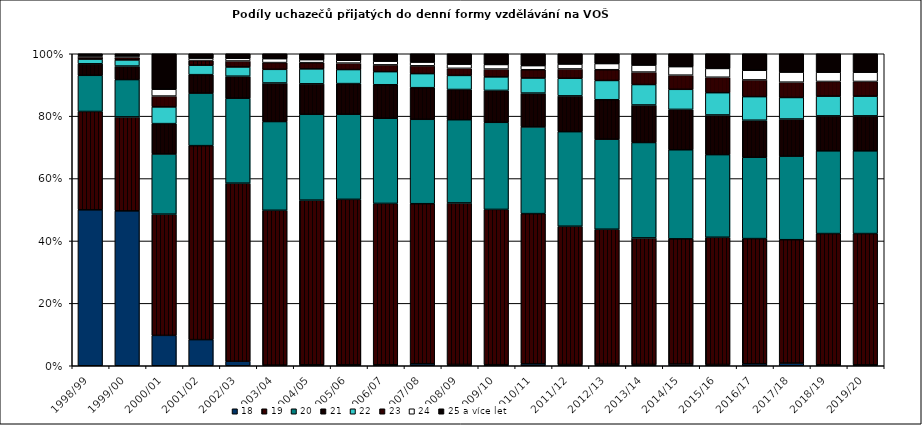
| Category | 18 | 19 | 20 | 21 | 22 | 23 | 24 | 25 a více let  |
|---|---|---|---|---|---|---|---|---|
| 1998/99 | 0.5 | 0.315 | 0.116 | 0.037 | 0.015 | 0.007 | 0.005 | 0.006 |
| 1999/00 | 0.496 | 0.301 | 0.12 | 0.043 | 0.02 | 0.008 | 0.005 | 0.007 |
| 2000/01 | 0.097 | 0.389 | 0.193 | 0.097 | 0.054 | 0.035 | 0.022 | 0.114 |
| 2001/02 | 0.084 | 0.622 | 0.168 | 0.059 | 0.03 | 0.015 | 0.008 | 0.014 |
| 2002/03 | 0.014 | 0.571 | 0.272 | 0.071 | 0.03 | 0.019 | 0.009 | 0.015 |
| 2003/04 | 0.002 | 0.496 | 0.284 | 0.124 | 0.044 | 0.022 | 0.013 | 0.016 |
| 2004/05 | 0.003 | 0.528 | 0.275 | 0.098 | 0.048 | 0.02 | 0.01 | 0.019 |
| 2005/06 | 0.003 | 0.53 | 0.273 | 0.098 | 0.045 | 0.021 | 0.009 | 0.021 |
| 2006/07 | 0.003 | 0.517 | 0.273 | 0.107 | 0.042 | 0.022 | 0.012 | 0.024 |
| 2007/08 | 0.006 | 0.513 | 0.271 | 0.101 | 0.045 | 0.025 | 0.012 | 0.027 |
| 2008/09 | 0.004 | 0.518 | 0.267 | 0.097 | 0.045 | 0.023 | 0.013 | 0.033 |
| 2009/10 | 0.003 | 0.498 | 0.279 | 0.102 | 0.043 | 0.025 | 0.015 | 0.034 |
| 2010/11 | 0.006 | 0.481 | 0.278 | 0.108 | 0.048 | 0.027 | 0.013 | 0.038 |
| 2011/12 | 0.004 | 0.443 | 0.303 | 0.115 | 0.056 | 0.03 | 0.016 | 0.033 |
| 2012/13 | 0.005 | 0.433 | 0.289 | 0.126 | 0.062 | 0.034 | 0.02 | 0.031 |
| 2013/14 | 0.004 | 0.405 | 0.306 | 0.12 | 0.065 | 0.04 | 0.022 | 0.036 |
| 2014/15 | 0.006 | 0.401 | 0.286 | 0.129 | 0.064 | 0.045 | 0.027 | 0.041 |
| 2015/16 | 0.004 | 0.408 | 0.265 | 0.127 | 0.071 | 0.05 | 0.028 | 0.047 |
| 2016/17 | 0.006 | 0.401 | 0.261 | 0.119 | 0.076 | 0.054 | 0.031 | 0.053 |
| 2017/18 | 0.008 | 0.395 | 0.268 | 0.119 | 0.069 | 0.049 | 0.032 | 0.059 |
| 2018/19 | 0.003 | 0.421 | 0.265 | 0.112 | 0.063 | 0.047 | 0.03 | 0.059 |
| 2019/20 | 0.003 | 0.421 | 0.265 | 0.112 | 0.063 | 0.047 | 0.03 | 0.059 |